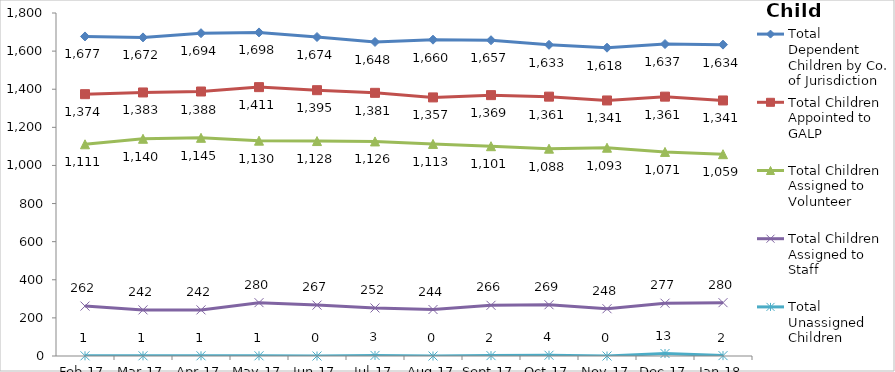
| Category | Total Dependent Children by Co. of Jurisdiction | Total Children Appointed to GALP | Total Children Assigned to Volunteer | Total Children Assigned to Staff | Total Unassigned Children |
|---|---|---|---|---|---|
| 2017-02-01 | 1677 | 1374 | 1111 | 262 | 1 |
| 2017-03-01 | 1672 | 1383 | 1140 | 242 | 1 |
| 2017-04-01 | 1694 | 1388 | 1145 | 242 | 1 |
| 2017-05-01 | 1698 | 1411 | 1130 | 280 | 1 |
| 2017-06-01 | 1674 | 1395 | 1128 | 267 | 0 |
| 2017-07-01 | 1648 | 1381 | 1126 | 252 | 3 |
| 2017-08-01 | 1660 | 1357 | 1113 | 244 | 0 |
| 2017-09-01 | 1657 | 1369 | 1101 | 266 | 2 |
| 2017-10-01 | 1633 | 1361 | 1088 | 269 | 4 |
| 2017-11-01 | 1618 | 1341 | 1093 | 248 | 0 |
| 2017-12-01 | 1637 | 1361 | 1071 | 277 | 13 |
| 2018-01-01 | 1634 | 1341 | 1059 | 280 | 2 |